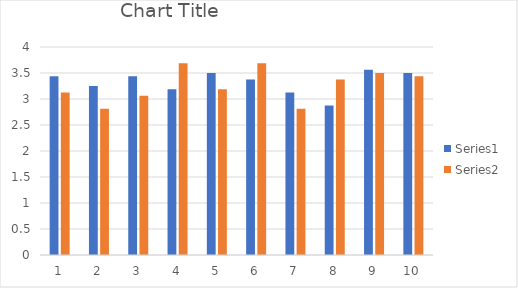
| Category | Series 0 | Series 1 |
|---|---|---|
| 1.0 | 3.438 | 3.125 |
| 2.0 | 3.25 | 2.812 |
| 3.0 | 3.438 | 3.062 |
| 4.0 | 3.188 | 3.688 |
| 5.0 | 3.5 | 3.188 |
| 6.0 | 3.375 | 3.688 |
| 7.0 | 3.125 | 2.812 |
| 8.0 | 2.875 | 3.375 |
| 9.0 | 3.562 | 3.5 |
| 10.0 | 3.5 | 3.438 |